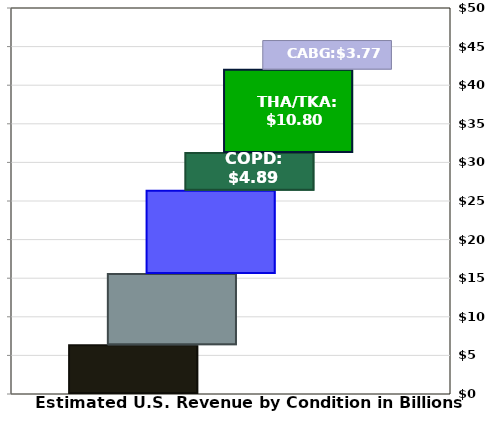
| Category | Series 0 | Series 1 | Series 2 | Series 3 | Series 4 | Series 5 |
|---|---|---|---|---|---|---|
| 0 | 6306892100 | 9248341300 | 10767469700 | 4894635600 | 10796930400 | 3771267600 |